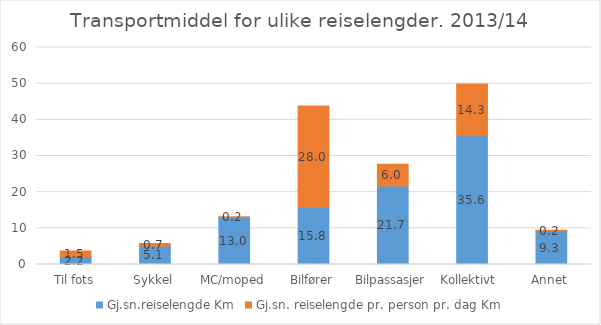
| Category | Gj.sn.reiselengde Km | Gj.sn. reiselengde pr. person pr. dag Km |
|---|---|---|
| Til fots | 2.2 | 1.5 |
| Sykkel | 5.1 | 0.7 |
| MC/moped | 13 | 0.2 |
| Bilfører | 15.8 | 28 |
| Bilpassasjer | 21.7 | 6 |
| Kollektivt  | 35.6 | 14.3 |
| Annet | 9.3 | 0.2 |